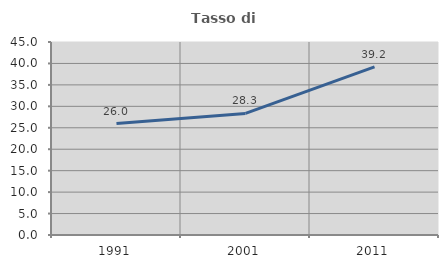
| Category | Tasso di occupazione   |
|---|---|
| 1991.0 | 25.994 |
| 2001.0 | 28.341 |
| 2011.0 | 39.194 |